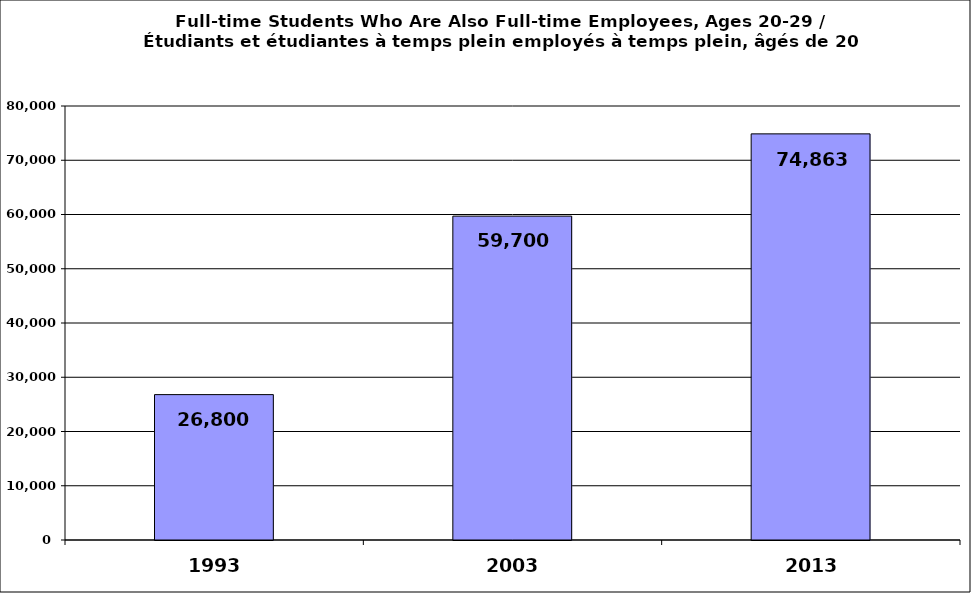
| Category | Series 0 |
|---|---|
| 1993.0 | 26800 |
| 2003.0 | 59700 |
| 2013.0 | 74862.5 |